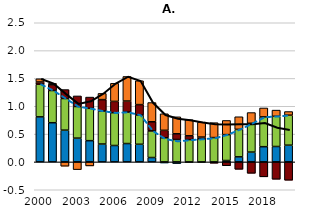
| Category | Capital stock per worker | Trend labour efficiency | Trend working-age population ratio | Trend employment rate |
|---|---|---|---|---|
| 2000.0 | 0.81 | 0.587 | 0.039 | 0.058 |
| 2001.0 | 0.704 | 0.578 | 0.102 | 0.026 |
| 2002.0 | 0.571 | 0.568 | 0.161 | -0.077 |
| 2003.0 | 0.427 | 0.568 | 0.19 | -0.138 |
| 2004.0 | 0.382 | 0.58 | 0.203 | -0.072 |
| 2005.0 | 0.322 | 0.593 | 0.204 | 0.112 |
| 2006.0 | 0.295 | 0.589 | 0.203 | 0.325 |
| 2007.0 | 0.33 | 0.565 | 0.198 | 0.441 |
| 2008.0 | 0.317 | 0.525 | 0.187 | 0.429 |
| 2009.0 | 0.079 | 0.478 | 0.164 | 0.345 |
| 2010.0 | -0.019 | 0.434 | 0.134 | 0.298 |
| 2011.0 | -0.03 | 0.403 | 0.102 | 0.305 |
| 2012.0 | -0.006 | 0.401 | 0.068 | 0.288 |
| 2013.0 | -0.004 | 0.415 | 0.031 | 0.269 |
| 2014.0 | -0.008 | 0.438 | -0.015 | 0.267 |
| 2015.0 | 0.025 | 0.465 | -0.069 | 0.254 |
| 2016.0 | 0.091 | 0.494 | -0.133 | 0.227 |
| 2017.0 | 0.177 | 0.518 | -0.204 | 0.192 |
| 2018.0 | 0.274 | 0.535 | -0.268 | 0.16 |
| 2019.0 | 0.277 | 0.543 | -0.311 | 0.111 |
| 2020.0 | 0.301 | 0.539 | -0.329 | 0.065 |